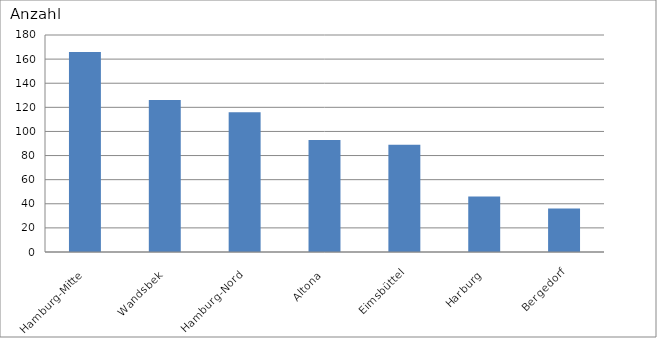
| Category | Hamburg-Mitte Wandsbek Hamburg-Nord Altona Eimsbüttel Harburg Bergedorf |
|---|---|
| Hamburg-Mitte | 166 |
| Wandsbek | 126 |
| Hamburg-Nord | 116 |
| Altona | 93 |
| Eimsbüttel | 89 |
| Harburg | 46 |
| Bergedorf | 36 |